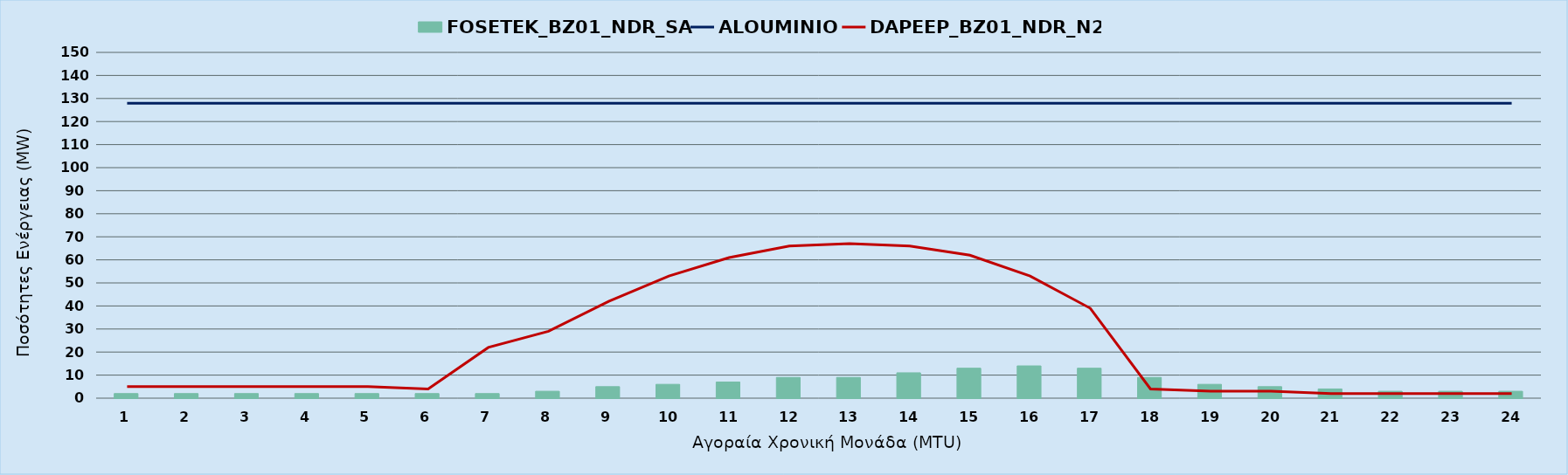
| Category | FOSETEK_BZ01_NDR_SA |
|---|---|
| 0 | 2 |
| 1 | 2 |
| 2 | 2 |
| 3 | 2 |
| 4 | 2 |
| 5 | 2 |
| 6 | 2 |
| 7 | 3 |
| 8 | 5 |
| 9 | 6 |
| 10 | 7 |
| 11 | 9 |
| 12 | 9 |
| 13 | 11 |
| 14 | 13 |
| 15 | 14 |
| 16 | 13 |
| 17 | 9 |
| 18 | 6 |
| 19 | 5 |
| 20 | 4 |
| 21 | 3 |
| 22 | 3 |
| 23 | 3 |